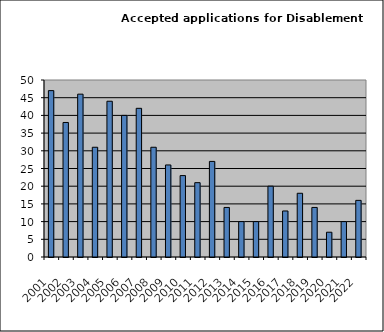
| Category | Series 1 |
|---|---|
| 2001.0 | 47 |
| 2002.0 | 38 |
| 2003.0 | 46 |
| 2004.0 | 31 |
| 2005.0 | 44 |
| 2006.0 | 40 |
| 2007.0 | 42 |
| 2008.0 | 31 |
| 2009.0 | 26 |
| 2010.0 | 23 |
| 2011.0 | 21 |
| 2012.0 | 27 |
| 2013.0 | 14 |
| 2014.0 | 10 |
| 2015.0 | 10 |
| 2016.0 | 20 |
| 2017.0 | 13 |
| 2018.0 | 18 |
| 2019.0 | 14 |
| 2020.0 | 7 |
| 2021.0 | 10 |
| 2022.0 | 16 |